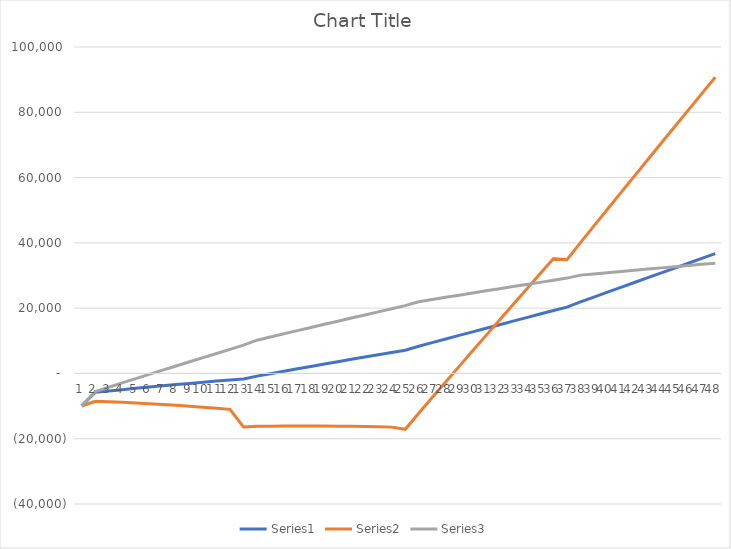
| Category | Series 0 | Series 1 | Series 2 |
|---|---|---|---|
| 0 | -9874.125 | -9984.958 | -9981 |
| 1 | -5789.15 | -8526.322 | -5547.275 |
| 2 | -5375.097 | -8672.117 | -4221.972 |
| 3 | -4969.213 | -8842.419 | -2904.838 |
| 4 | -4571.252 | -9036.494 | -1595.627 |
| 5 | -4180.979 | -9253.627 | -294.104 |
| 6 | -3798.161 | -9493.128 | 999.964 |
| 7 | -3422.574 | -9754.325 | 2286.801 |
| 8 | -3054.003 | -10036.567 | 3566.622 |
| 9 | -2692.237 | -10339.223 | 4839.638 |
| 10 | -2337.071 | -10661.68 | 6106.054 |
| 11 | -1988.308 | -11003.345 | 7366.067 |
| 12 | -1694.917 | -16398.553 | 8649.874 |
| 13 | -822.963 | -16213.424 | 10174.745 |
| 14 | -73.103 | -16162.917 | 11160.855 |
| 15 | 671.089 | -16130.231 | 12141.298 |
| 16 | 1409.784 | -16114.832 | 13116.242 |
| 17 | 2143.145 | -16116.201 | 14085.854 |
| 18 | 2871.334 | -16133.834 | 15050.292 |
| 19 | 3594.504 | -16167.244 | 16009.712 |
| 20 | 4312.807 | -16215.958 | 16964.265 |
| 21 | 5026.389 | -16279.516 | 17914.097 |
| 22 | 5735.391 | -16357.474 | 18859.349 |
| 23 | 6439.95 | -16449.398 | 19800.159 |
| 24 | 7091.038 | -17110.329 | 20766.663 |
| 25 | 8322.534 | -12185.991 | 21976.076 |
| 26 | 9433.726 | -7391.493 | 22648.517 |
| 27 | 10540.984 | -2610.176 | 23317.026 |
| 28 | 11644.428 | 2158.354 | 23981.72 |
| 29 | 12744.172 | 6914.481 | 24642.714 |
| 30 | 13840.326 | 11658.577 | 25300.118 |
| 31 | 14932.999 | 16391.003 | 25954.041 |
| 32 | 16022.295 | 21112.11 | 26604.586 |
| 33 | 17108.314 | 25822.236 | 27251.856 |
| 34 | 18191.156 | 30521.711 | 27895.948 |
| 35 | 19270.916 | 35210.856 | 28536.958 |
| 36 | 20298.524 | 34855.066 | 29204.982 |
| 37 | 21907.819 | 40087.966 | 30117.194 |
| 38 | 23398.05 | 45194.344 | 30493.675 |
| 39 | 24885.554 | 50290.76 | 30867.429 |
| 40 | 26370.41 | 55377.511 | 31238.535 |
| 41 | 27852.699 | 60454.888 | 31607.074 |
| 42 | 29332.497 | 65523.171 | 31973.122 |
| 43 | 30809.88 | 70582.635 | 32336.755 |
| 44 | 32284.919 | 75633.543 | 32698.044 |
| 45 | 33757.686 | 80676.152 | 33057.061 |
| 46 | 35228.248 | 85710.711 | 33413.873 |
| 47 | 36696.671 | 90737.461 | 33768.546 |